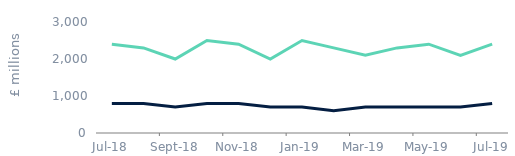
| Category | House purchase | Remortgage |
|---|---|---|
| 2018-07-01 | 800 | 2400 |
| 2018-08-01 | 800 | 2300 |
| 2018-09-01 | 700 | 2000 |
| 2018-10-01 | 800 | 2500 |
| 2018-11-01 | 800 | 2400 |
| 2018-12-01 | 700 | 2000 |
| 2019-01-01 | 700 | 2500 |
| 2019-02-01 | 600 | 2300 |
| 2019-03-01 | 700 | 2100 |
| 2019-04-01 | 700 | 2300 |
| 2019-05-01 | 700 | 2400 |
| 2019-06-01 | 700 | 2100 |
| 2019-07-01 | 800 | 2400 |